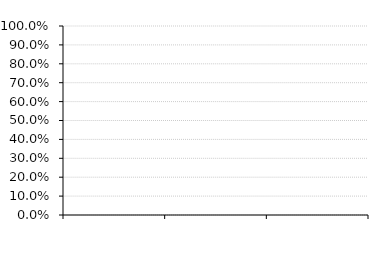
| Category | Operating Profit Ratio |
|---|---|
| 0 | 0 |
| 1 | 0 |
| 2 | 0 |